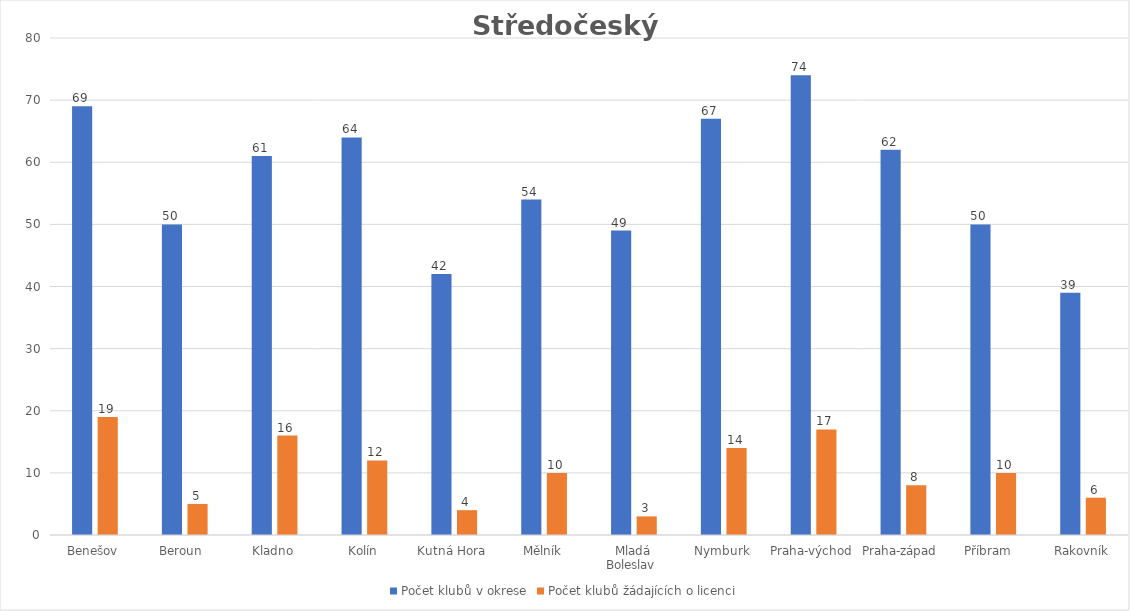
| Category | Počet klubů v okrese | Počet klubů žádajících o licenci |
|---|---|---|
| Benešov | 69 | 19 |
| Beroun  | 50 | 5 |
| Kladno | 61 | 16 |
| Kolín | 64 | 12 |
| Kutná Hora  | 42 | 4 |
| Mělník | 54 | 10 |
| Mladá Boleslav  | 49 | 3 |
| Nymburk | 67 | 14 |
| Praha-východ | 74 | 17 |
| Praha-západ  | 62 | 8 |
| Příbram   | 50 | 10 |
| Rakovník | 39 | 6 |